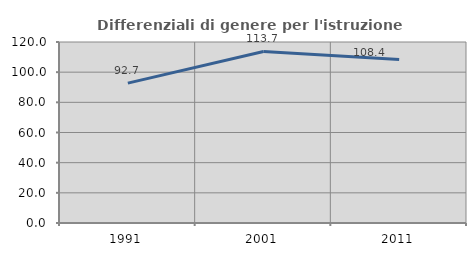
| Category | Differenziali di genere per l'istruzione superiore |
|---|---|
| 1991.0 | 92.736 |
| 2001.0 | 113.747 |
| 2011.0 | 108.363 |